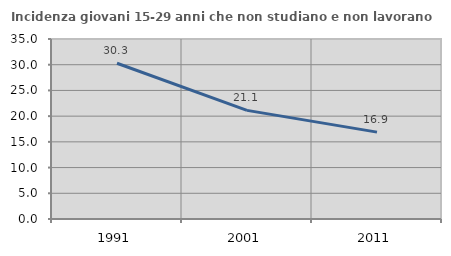
| Category | Incidenza giovani 15-29 anni che non studiano e non lavorano  |
|---|---|
| 1991.0 | 30.282 |
| 2001.0 | 21.12 |
| 2011.0 | 16.895 |